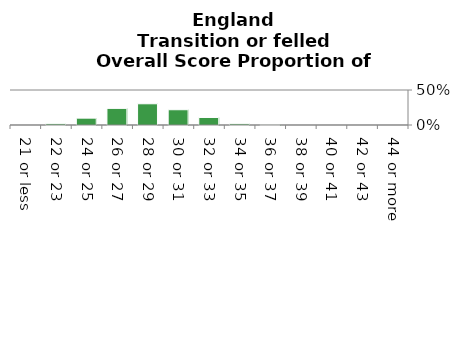
| Category | Transition or felled |
|---|---|
| 21 or less | 0 |
| 22 or 23 | 0.018 |
| 24 or 25 | 0.098 |
| 26 or 27 | 0.237 |
| 28 or 29 | 0.303 |
| 30 or 31 | 0.218 |
| 32 or 33 | 0.107 |
| 34 or 35 | 0.017 |
| 36 or 37 | 0.001 |
| 38 or 39 | 0 |
| 40 or 41 | 0 |
| 42 or 43 | 0 |
| 44 or more | 0 |